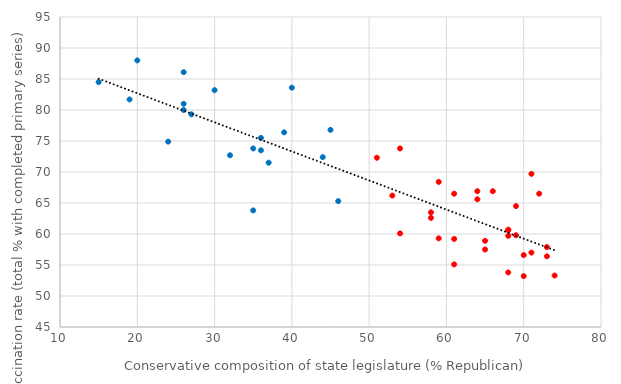
| Category | Percent of total pop with a completed primary series |
|---|---|
| 74.0 | 53.3 |
| 46.0 | 65.3 |
| 53.0 | 66.2 |
| 71.0 | 57 |
| 24.0 | 74.9 |
| 35.0 | 73.8 |
| 30.0 | 83.2 |
| 36.0 | 73.5 |
| 71.0 | 69.7 |
| 65.0 | 57.5 |
| 19.0 | 81.7 |
| 70.0 | 56.6 |
| 37.0 | 71.5 |
| 73.0 | 57.9 |
| 69.0 | 64.5 |
| 64.0 | 65.6 |
| 68.0 | 59.7 |
| 61.0 | 55.1 |
| 40.0 | 83.6 |
| 26.0 | 80 |
| 15.0 | 84.5 |
| 58.0 | 62.6 |
| 44.0 | 72.4 |
| 68.0 | 53.8 |
| 61.0 | 59.2 |
| 59.0 | 59.3 |
| 61.0 | 66.5 |
| 35.0 | 63.8 |
| 51.0 | 72.3 |
| 27.0 | 79.3 |
| 36.0 | 75.5 |
| 26.0 | 81 |
| 66.0 | 66.9 |
| 65.0 | 58.9 |
| 68.0 | 60.7 |
| 68.0 | 60.6 |
| 32.0 | 72.7 |
| 54.0 | 73.8 |
| 20.0 | 88 |
| 54.0 | 60.1 |
| 72.0 | 66.5 |
| 73.0 | 56.4 |
| 58.0 | 63.5 |
| 64.0 | 66.9 |
| 26.0 | 86.1 |
| 45.0 | 76.8 |
| 39.0 | 76.4 |
| 69.0 | 59.8 |
| 59.0 | 68.4 |
| 70.0 | 53.2 |